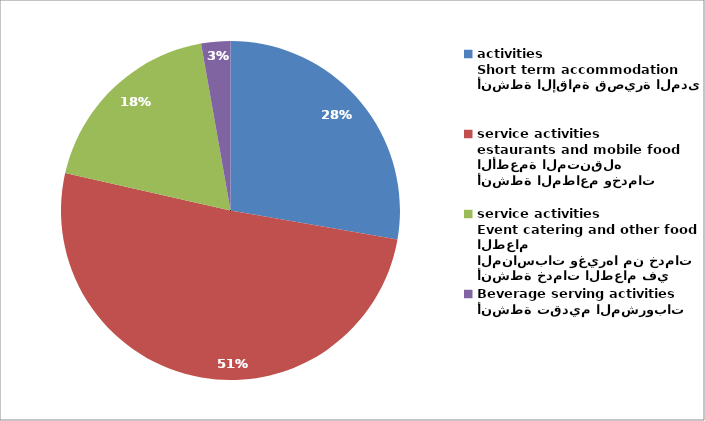
| Category | Series 0 |
|---|---|
| أنشطة الإقامة قصيرة المدى
Short term accommodation activities | 21515 |
| أنشطة المطاعم وخدمات الأطعمة المتنقله
estaurants and mobile food service activities | 39396 |
| أنشطة خدمات الطعام في المناسبات وغيرها من خدمات الطعام
Event catering and other food service activities | 14486 |
| أنشطة تقديم المشروبات
Beverage serving activities | 2157 |